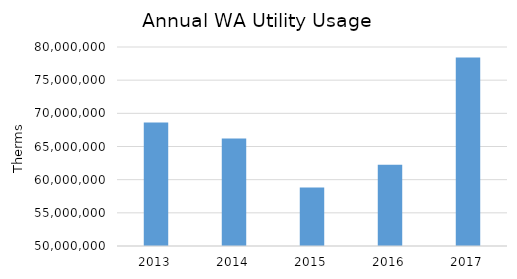
| Category | Series 0 |
|---|---|
| 2013.0 | 68600576.2 |
| 2014.0 | 66195150.2 |
| 2015.0 | 58830484.2 |
| 2016.0 | 62249325 |
| 2017.0 | 78434741.2 |